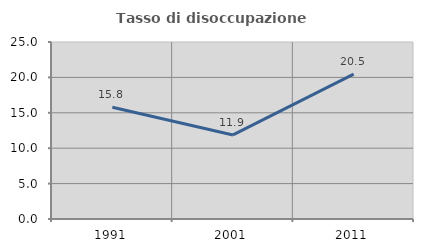
| Category | Tasso di disoccupazione giovanile  |
|---|---|
| 1991.0 | 15.777 |
| 2001.0 | 11.871 |
| 2011.0 | 20.455 |